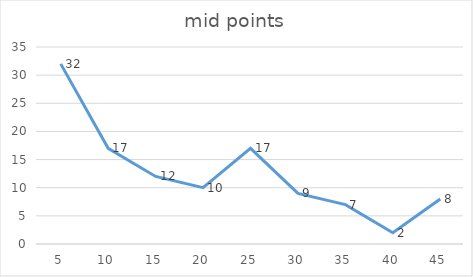
| Category | mid points |
|---|---|
| 5.0 | 32 |
| 10.0 | 17 |
| 15.0 | 12 |
| 20.0 | 10 |
| 25.0 | 17 |
| 30.0 | 9 |
| 35.0 | 7 |
| 40.0 | 2 |
| 45.0 | 8 |